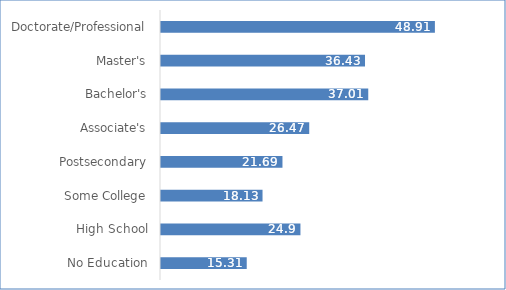
| Category | Series 0 |
|---|---|
| No Education | 15.31 |
| High School | 24.9 |
| Some College | 18.13 |
| Postsecondary | 21.69 |
| Associate's | 26.47 |
| Bachelor's | 37.01 |
| Master's | 36.43 |
| Doctorate/Professional | 48.91 |